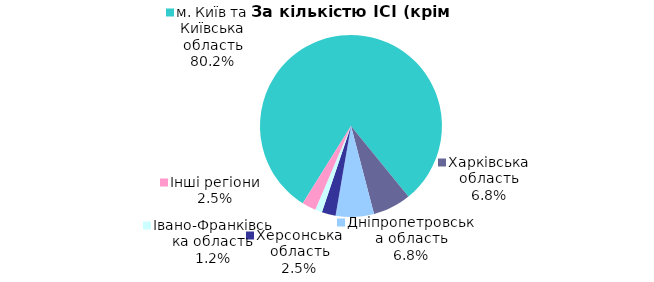
| Category | Series 0 |
|---|---|
| м. Київ та Київська область | 0.802 |
| Харківська область | 0.068 |
| Дніпропетровська область | 0.068 |
| Херсонська область | 0.025 |
| Iвано-Франкiвська область | 0.012 |
| Інші регіони | 0.025 |